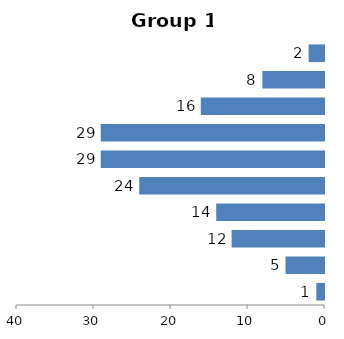
| Category | Group 1 |
|---|---|
| 0-10 | 1 |
| 11-20 | 5 |
| 21-30 | 12 |
| 31-40 | 14 |
| 41-50 | 24 |
| 51-60 | 29 |
| 61-70 | 29 |
| 71-80 | 16 |
| 81-90 | 8 |
| 91-100 | 2 |